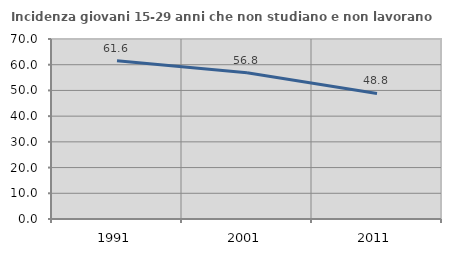
| Category | Incidenza giovani 15-29 anni che non studiano e non lavorano  |
|---|---|
| 1991.0 | 61.561 |
| 2001.0 | 56.839 |
| 2011.0 | 48.806 |